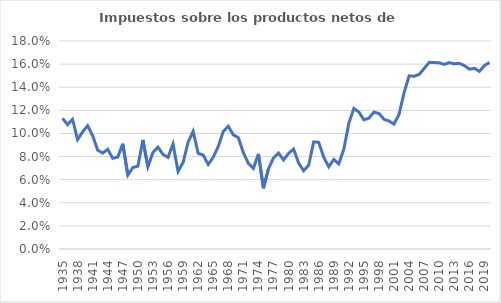
| Category | Impuestos sobre los productos netos de subsidios |
|---|---|
| 1935.0 | 0.113 |
| 1936.0 | 0.108 |
| 1937.0 | 0.112 |
| 1938.0 | 0.095 |
| 1939.0 | 0.101 |
| 1940.0 | 0.107 |
| 1941.0 | 0.098 |
| 1942.0 | 0.086 |
| 1943.0 | 0.083 |
| 1944.0 | 0.086 |
| 1945.0 | 0.078 |
| 1946.0 | 0.08 |
| 1947.0 | 0.091 |
| 1948.0 | 0.064 |
| 1949.0 | 0.071 |
| 1950.0 | 0.072 |
| 1951.0 | 0.094 |
| 1952.0 | 0.071 |
| 1953.0 | 0.084 |
| 1954.0 | 0.088 |
| 1955.0 | 0.082 |
| 1956.0 | 0.079 |
| 1957.0 | 0.091 |
| 1958.0 | 0.067 |
| 1959.0 | 0.075 |
| 1960.0 | 0.092 |
| 1961.0 | 0.102 |
| 1962.0 | 0.083 |
| 1963.0 | 0.081 |
| 1964.0 | 0.073 |
| 1965.0 | 0.079 |
| 1966.0 | 0.089 |
| 1967.0 | 0.102 |
| 1968.0 | 0.106 |
| 1969.0 | 0.099 |
| 1970.0 | 0.096 |
| 1971.0 | 0.083 |
| 1972.0 | 0.074 |
| 1973.0 | 0.07 |
| 1974.0 | 0.082 |
| 1975.0 | 0.053 |
| 1976.0 | 0.069 |
| 1977.0 | 0.079 |
| 1978.0 | 0.083 |
| 1979.0 | 0.077 |
| 1980.0 | 0.083 |
| 1981.0 | 0.086 |
| 1982.0 | 0.074 |
| 1983.0 | 0.068 |
| 1984.0 | 0.072 |
| 1985.0 | 0.093 |
| 1986.0 | 0.092 |
| 1987.0 | 0.079 |
| 1988.0 | 0.071 |
| 1989.0 | 0.078 |
| 1990.0 | 0.074 |
| 1991.0 | 0.086 |
| 1992.0 | 0.109 |
| 1993.0 | 0.122 |
| 1994.0 | 0.118 |
| 1995.0 | 0.112 |
| 1996.0 | 0.113 |
| 1997.0 | 0.118 |
| 1998.0 | 0.117 |
| 1999.0 | 0.112 |
| 2000.0 | 0.111 |
| 2001.0 | 0.108 |
| 2002.0 | 0.117 |
| 2003.0 | 0.135 |
| 2004.0 | 0.15 |
| 2005.0 | 0.149 |
| 2006.0 | 0.151 |
| 2007.0 | 0.156 |
| 2008.0 | 0.162 |
| 2009.0 | 0.161 |
| 2010.0 | 0.161 |
| 2011.0 | 0.16 |
| 2012.0 | 0.161 |
| 2013.0 | 0.16 |
| 2014.0 | 0.161 |
| 2015.0 | 0.159 |
| 2016.0 | 0.156 |
| 2017.0 | 0.156 |
| 2018.0 | 0.154 |
| 2019.0 | 0.159 |
| 2020.0 | 0.161 |